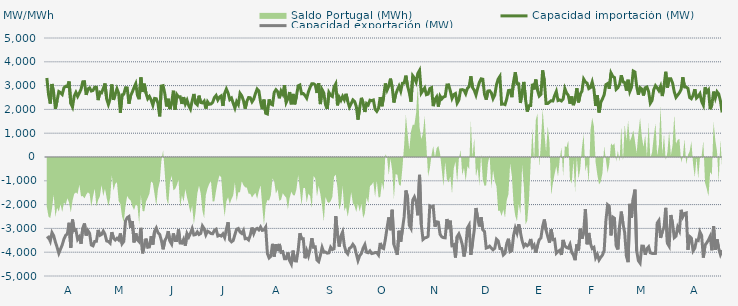
| Category | Capacidad importación (MW) | Capacidad exportación (MW) |
|---|---|---|
| 0 | 3320.625 | -3422.292 |
| 1900-01-01 | 2615.625 | -3370.417 |
| 1900-01-02 | 2244.375 | -3535.625 |
| 1900-01-03 | 3067.5 | -3176.25 |
| 1900-01-04 | 2692.458 | -3306.875 |
| 1900-01-05 | 2025 | -3576.042 |
| 1900-01-06 | 2373.833 | -3795 |
| 1900-01-07 | 2750.458 | -4045 |
| 1900-01-08 | 2704.167 | -3868.417 |
| 1900-01-09 | 2628.75 | -3691.667 |
| 1900-01-10 | 2910 | -3448.125 |
| 1900-01-11 | 2971.875 | -3293.375 |
| 1900-01-12 | 2958.5 | -3229.167 |
| 1900-01-13 | 3174.375 | -2764.583 |
| 1900-01-14 | 2253.75 | -3813.75 |
| 1900-01-15 | 2100 | -2628.667 |
| 1900-01-16 | 2557.5 | -3088.333 |
| 1900-01-17 | 2713.125 | -3062.25 |
| 1900-01-18 | 2546.875 | -3463.625 |
| 1900-01-19 | 2686.458 | -3359.458 |
| 1900-01-20 | 2850 | -3646.042 |
| 1900-01-21 | 3159.375 | -2992.292 |
| 1900-01-22 | 3166.875 | -2793.125 |
| 1900-01-23 | 2613.75 | -3298.833 |
| 1900-01-24 | 2857.5 | -3089.625 |
| 1900-01-25 | 2903.875 | -3210.125 |
| 1900-01-26 | 2772 | -3696.792 |
| 1900-01-27 | 2797.5 | -3731.25 |
| 1900-01-28 | 2930.625 | -3545.625 |
| 1900-01-29 | 2932.5 | -3541.875 |
| 1900-01-30 | 2390.625 | -3064.167 |
| 1900-01-31 | 2726.25 | -3293.333 |
| 1900-02-01 | 2694.375 | -3252.708 |
| 1900-02-02 | 2878.125 | -3111.875 |
| 1900-02-03 | 3088.125 | -3247.5 |
| 1900-02-04 | 2435.625 | -3528.958 |
| 1900-02-05 | 2206.875 | -3547.708 |
| 1900-02-06 | 2435.625 | -3618.75 |
| 1900-02-07 | 3046.875 | -3157.917 |
| 1900-02-08 | 2400 | -3406.875 |
| 1900-02-09 | 2640 | -3488.125 |
| 1900-02-10 | 2866.875 | -3413.542 |
| 1900-02-11 | 2675.625 | -3486.458 |
| 1900-02-12 | 1861.25 | -3211.667 |
| 1900-02-13 | 2611.875 | -3644.375 |
| 1900-02-14 | 2638.125 | -3547.083 |
| 1900-02-15 | 2906.25 | -2688.333 |
| 1900-02-16 | 2904.375 | -2549.583 |
| 1900-02-17 | 2240.625 | -2502.083 |
| 1900-02-18 | 2576.25 | -2981.667 |
| 1900-02-19 | 2732.25 | -2689.375 |
| 1900-02-20 | 2919.375 | -3586.875 |
| 1900-02-21 | 3078.75 | -3206.25 |
| 1900-02-22 | 2587.5 | -3481.875 |
| 1900-02-23 | 2430 | -3560.625 |
| 1900-02-24 | 3341.25 | -2977.542 |
| 1900-02-25 | 2733.75 | -4046.25 |
| 1900-02-26 | 3080.625 | -3725.417 |
| 1900-02-27 | 2681.25 | -3429.375 |
| 1900-02-28 | 2448.75 | -3793.125 |
| 1900-02-28 | 2544.125 | -3778.125 |
| 1900-03-01 | 2394.958 | -3328.125 |
| 1900-03-02 | 2175 | -3678.75 |
| 1900-03-03 | 2461.167 | -3117.375 |
| 1900-03-04 | 2448.75 | -2981.542 |
| 1900-03-05 | 2255.042 | -3185.833 |
| 1900-03-06 | 1708.042 | -3250.208 |
| 1900-03-07 | 2981.25 | -3508.125 |
| 1900-03-08 | 2998.125 | -3877.5 |
| 1900-03-09 | 2664.375 | -3519.375 |
| 1900-03-10 | 2124.375 | -3382.5 |
| 1900-03-11 | 2446.875 | -3115.792 |
| 1900-03-12 | 2015.417 | -3534.375 |
| 1900-03-13 | 2289.375 | -3658.125 |
| 1900-03-14 | 2784.375 | -3211.083 |
| 1900-03-15 | 1993.125 | -3504.792 |
| 1900-03-16 | 2624.875 | -3506.458 |
| 1900-03-17 | 2523.75 | -3042.583 |
| 1900-03-18 | 2531.25 | -3613.125 |
| 1900-03-19 | 2229.583 | -3620.625 |
| 1900-03-20 | 2515.875 | -3455.625 |
| 1900-03-21 | 2227.5 | -3723.75 |
| 1900-03-22 | 2388.375 | -3217.458 |
| 1900-03-23 | 2157.875 | -3361.542 |
| 1900-03-24 | 2014.583 | -3202.708 |
| 1900-03-25 | 2357.917 | -3006.583 |
| 1900-03-26 | 2647.75 | -3275.625 |
| 1900-03-27 | 2259.375 | -3258.75 |
| 1900-03-28 | 2191.875 | -3148.125 |
| 1900-03-29 | 2578.125 | -3256.875 |
| 1900-03-30 | 2289.375 | -3211.875 |
| 1900-03-31 | 2272.917 | -2898.25 |
| 1900-04-01 | 2349.75 | -3012.25 |
| 1900-04-02 | 2034.167 | -3270 |
| 1900-04-03 | 2319.375 | -3116.25 |
| 1900-04-04 | 2214.375 | -3159.375 |
| 1900-04-05 | 2229.167 | -3217.5 |
| 1900-04-06 | 2296.875 | -3223.125 |
| 1900-04-07 | 2497.5 | -3080.208 |
| 1900-04-08 | 2585.5 | -3034.292 |
| 1900-04-09 | 2394.375 | -3318.75 |
| 1900-04-10 | 2520 | -3286.875 |
| 1900-04-11 | 2570.625 | -3320.625 |
| 1900-04-12 | 2145 | -3229.583 |
| 1900-04-13 | 2673.75 | -3384.375 |
| 1900-04-14 | 2855.625 | -3040.333 |
| 1900-04-15 | 2689.875 | -2741.708 |
| 1900-04-16 | 2413.125 | -3485.625 |
| 1900-04-17 | 2476.875 | -3564.375 |
| 1900-04-18 | 2258.75 | -3510 |
| 1900-04-19 | 2056.875 | -3258.75 |
| 1900-04-20 | 2326.875 | -3036.667 |
| 1900-04-21 | 2203.125 | -3003.75 |
| 1900-04-22 | 2675.333 | -3153.417 |
| 1900-04-23 | 2572.5 | -3211.875 |
| 1900-04-24 | 2368.125 | -3082.917 |
| 1900-04-25 | 2032.5 | -3433.125 |
| 1900-04-26 | 2340 | -3418.125 |
| 1900-04-27 | 2499.375 | -3485.625 |
| 1900-04-28 | 2488.125 | -3277.5 |
| 1900-04-29 | 2317.5 | -2963.167 |
| 1900-04-30 | 2431.875 | -3217.5 |
| 1900-05-01 | 2668.125 | -3039.375 |
| 1900-05-02 | 2855.625 | -2998.125 |
| 1900-05-03 | 2778.75 | -3061.667 |
| 1900-05-04 | 2311.875 | -2941.042 |
| 1900-05-05 | 2010 | -3084.375 |
| 1900-05-06 | 2411.25 | -3065.625 |
| 1900-05-07 | 1837.917 | -2945.625 |
| 1900-05-08 | 1809.167 | -4055.625 |
| 1900-05-09 | 2419.792 | -4241.25 |
| 1900-05-10 | 2227.5 | -4173.75 |
| 1900-05-11 | 2191.875 | -3648.75 |
| 1900-05-12 | 2715 | -4183.125 |
| 1900-05-13 | 2826.625 | -3667.292 |
| 1900-05-14 | 2745 | -3950.625 |
| 1900-05-15 | 2467.5 | -3652.625 |
| 1900-05-16 | 2771.25 | -4006.875 |
| 1900-05-17 | 2640 | -3980.625 |
| 1900-05-18 | 3016.875 | -4271.25 |
| 1900-05-19 | 2292.292 | -4271.25 |
| 1900-05-20 | 2448.75 | -4010.625 |
| 1900-05-21 | 2730 | -4357.5 |
| 1900-05-22 | 2214.75 | -4501.875 |
| 1900-05-23 | 2650.208 | -3931.667 |
| 1900-05-24 | 2212.5 | -4361.25 |
| 1900-05-25 | 2565 | -4370.625 |
| 1900-05-26 | 2988.75 | -3920.625 |
| 1900-05-27 | 3024.375 | -3204.083 |
| 1900-05-28 | 2656.875 | -3437.708 |
| 1900-05-29 | 2664.375 | -3437.5 |
| 1900-05-30 | 2587.5 | -4254.375 |
| 1900-05-31 | 2473.125 | -3939.583 |
| 1900-06-01 | 2737.5 | -4156.875 |
| 1900-06-02 | 2932.5 | -3862.5 |
| 1900-06-03 | 3080.625 | -3412.708 |
| 1900-06-04 | 3078.125 | -3793.125 |
| 1900-06-05 | 3031.25 | -3776.25 |
| 1900-06-06 | 2689.875 | -4331.25 |
| 1900-06-07 | 3104.042 | -4396.875 |
| 1900-06-08 | 2223.25 | -4126.875 |
| 1900-06-09 | 2830.208 | -3799.583 |
| 1900-06-10 | 2694.375 | -3999.792 |
| 1900-06-11 | 2193.542 | -3994.167 |
| 1900-06-12 | 2019.375 | -4039.792 |
| 1900-06-13 | 2710.792 | -4026.667 |
| 1900-06-14 | 2589.292 | -3790.625 |
| 1900-06-15 | 2542.5 | -3888.75 |
| 1900-06-16 | 2943.75 | -3856.875 |
| 1900-06-17 | 3076.875 | -2486 |
| 1900-06-18 | 2169.583 | -3271.875 |
| 1900-06-19 | 2510.875 | -3762.292 |
| 1900-06-20 | 2379.375 | -3315.625 |
| 1900-06-21 | 2548.125 | -3149.875 |
| 1900-06-22 | 2405.625 | -3725.625 |
| 1900-06-23 | 2655.792 | -3978.75 |
| 1900-06-24 | 2338.917 | -4070.625 |
| 1900-06-25 | 2100.75 | -3836.25 |
| 1900-06-26 | 2239.583 | -3791.25 |
| 1900-06-27 | 2398.417 | -3671.25 |
| 1900-06-28 | 2333.375 | -3772.5 |
| 1900-06-29 | 2128.125 | -4065 |
| 1900-06-30 | 1568.375 | -4348.125 |
| 1900-07-01 | 2080.083 | -4146.125 |
| 1900-07-02 | 2486.208 | -4052.083 |
| 1900-07-03 | 2275.5 | -3824.583 |
| 1900-07-04 | 1891.708 | -3681.25 |
| 1900-07-05 | 2248.292 | -4001.25 |
| 1900-07-06 | 2190.75 | -4023.75 |
| 1900-07-07 | 2386.583 | -3945 |
| 1900-07-08 | 2366.708 | -4057.5 |
| 1900-07-09 | 2393.375 | -4042.25 |
| 1900-07-10 | 2007.375 | -4017.708 |
| 1900-07-11 | 1918.833 | -4016.25 |
| 1900-07-12 | 2042.417 | -4115.625 |
| 1900-07-13 | 2516.25 | -3611.25 |
| 1900-07-14 | 2132.708 | -3815.625 |
| 1900-07-15 | 2530.208 | -3849.375 |
| 1900-07-16 | 3090 | -3459.375 |
| 1900-07-17 | 2808.75 | -2974.875 |
| 1900-07-18 | 2978.125 | -2539.125 |
| 1900-07-19 | 3292.5 | -3075.208 |
| 1900-07-20 | 2935 | -2217.083 |
| 1900-07-21 | 2289.583 | -3673.125 |
| 1900-07-22 | 2619.375 | -3890.625 |
| 1900-07-23 | 2814.792 | -4110 |
| 1900-07-24 | 2979.375 | -3099.375 |
| 1900-07-25 | 2767.5 | -3556.875 |
| 1900-07-26 | 3099.375 | -3031.875 |
| 1900-07-27 | 3111.25 | -2508.75 |
| 1900-07-28 | 3418.125 | -1406.875 |
| 1900-07-29 | 2979.6 | -1681.6 |
| 1900-07-30 | 2705.333 | -2868.75 |
| 1900-07-31 | 2324.458 | -2999 |
| 1900-08-01 | 3414.375 | -1815.417 |
| 1900-08-02 | 3313.125 | -1677.917 |
| 1900-08-03 | 3144.583 | -1882.667 |
| 1900-08-04 | 3511.875 | -2448.75 |
| 1900-08-05 | 3639.375 | -750.708 |
| 1900-08-06 | 2688.958 | -2820 |
| 1900-08-07 | 2797.542 | -3465 |
| 1900-08-08 | 2902.5 | -3399.375 |
| 1900-08-09 | 2618.042 | -3382.5 |
| 1900-08-10 | 2643.417 | -3336.125 |
| 1900-08-11 | 2878.125 | -2058.75 |
| 1900-08-12 | 2915 | -2101.875 |
| 1900-08-13 | 2137.708 | -2068.125 |
| 1900-08-14 | 2411.042 | -2928.75 |
| 1900-08-15 | 2524.375 | -2722.5 |
| 1900-08-16 | 2118.542 | -2739.375 |
| 1900-08-17 | 2559.458 | -3244.292 |
| 1900-08-18 | 2440.833 | -3354.75 |
| 1900-08-19 | 2521.167 | -3387.25 |
| 1900-08-20 | 2546.333 | -3396.375 |
| 1900-08-21 | 3028.125 | -2606.25 |
| 1900-08-22 | 3031.875 | -3030 |
| 1900-08-23 | 2773.917 | -2675.625 |
| 1900-08-24 | 2465.417 | -3720 |
| 1900-08-25 | 2620.708 | -3684.375 |
| 1900-08-26 | 2665.625 | -4224.375 |
| 1900-08-27 | 2266.875 | -3343.125 |
| 1900-08-28 | 2395.625 | -3230.625 |
| 1900-08-29 | 2820.417 | -3421.875 |
| 1900-08-30 | 2831.667 | -3678.75 |
| 1900-08-31 | 2807.708 | -4181.25 |
| 1900-09-01 | 2656.917 | -3808.125 |
| 1900-09-02 | 2889.375 | -2983.125 |
| 1900-09-03 | 2955.417 | -2856.75 |
| 1900-09-04 | 3390.125 | -4111.875 |
| 1900-09-05 | 2918.167 | -3607.5 |
| 1900-09-06 | 2805 | -3067.5 |
| 1900-09-07 | 2603.792 | -2143.125 |
| 1900-09-08 | 2889.792 | -2566.125 |
| 1900-09-09 | 3138.75 | -2918.333 |
| 1900-09-10 | 3284.583 | -2531.167 |
| 1900-09-11 | 3266.875 | -3054.375 |
| 1900-09-12 | 2630.625 | -3127.125 |
| 1900-09-13 | 2410.625 | -3825 |
| 1900-09-14 | 2771.375 | -3800.625 |
| 1900-09-15 | 2785.375 | -3746.25 |
| 1900-09-16 | 2693.917 | -3833.125 |
| 1900-09-17 | 2453.958 | -3898.125 |
| 1900-09-18 | 2603.042 | -3832.458 |
| 1900-09-19 | 3040.208 | -3455.125 |
| 1900-09-20 | 3274.75 | -3527.125 |
| 1900-09-21 | 3387 | -3843.75 |
| 1900-09-22 | 2216.667 | -3847.5 |
| 1900-09-23 | 2229.75 | -4117.5 |
| 1900-09-24 | 2201.625 | -4044.375 |
| 1900-09-25 | 2438.958 | -3630 |
| 1900-09-26 | 2792.375 | -3435 |
| 1900-09-27 | 2803.958 | -3975 |
| 1900-09-28 | 2513.542 | -3933.75 |
| 1900-09-29 | 3165 | -3294.375 |
| 1900-09-30 | 3560.625 | -2987.875 |
| 1900-10-01 | 3075.25 | -3193.125 |
| 1900-10-02 | 3073.417 | -2827.208 |
| 1900-10-03 | 2270.625 | -3162.75 |
| 1900-10-04 | 2727.5 | -3519.375 |
| 1900-10-05 | 3154.417 | -3755.625 |
| 1900-10-06 | 2418.792 | -3661.875 |
| 1900-10-07 | 1908.75 | -3729.375 |
| 1900-10-08 | 2155 | -3669.625 |
| 1900-10-09 | 2159.708 | -3444.375 |
| 1900-10-10 | 3076.458 | -3791.25 |
| 1900-10-11 | 2842.292 | -3698.125 |
| 1900-10-12 | 3253.542 | -4020 |
| 1900-10-13 | 2809.042 | -3716.25 |
| 1900-10-14 | 2558.833 | -3474.375 |
| 1900-10-15 | 2631.875 | -3401.25 |
| 1900-10-16 | 3639.375 | -2911.875 |
| 1900-10-17 | 3192.292 | -2627.375 |
| 1900-10-18 | 2248.167 | -3073.125 |
| 1900-10-19 | 2244.375 | -3343.125 |
| 1900-10-20 | 2309.583 | -3596.625 |
| 1900-10-21 | 2366.167 | -3043.125 |
| 1900-10-22 | 2354.167 | -3474.375 |
| 1900-10-23 | 2578.958 | -3457.5 |
| 1900-10-24 | 2753.5 | -4040.625 |
| 1900-10-25 | 2372.208 | -3969.375 |
| 1900-10-26 | 2398.458 | -3918.75 |
| 1900-10-27 | 2354.167 | -4115.625 |
| 1900-10-28 | 2437.625 | -3484.625 |
| 1900-10-29 | 2874.167 | -3740.625 |
| 1900-10-30 | 2690.583 | -3803.75 |
| 1900-10-31 | 2590.875 | -3828.75 |
| 1900-11-01 | 2241.875 | -3671.25 |
| 1900-11-02 | 2542.292 | -4008.75 |
| 1900-11-03 | 2178.333 | -4123.125 |
| 1900-11-04 | 2426.208 | -4335 |
| 1900-11-05 | 2888.333 | -3675 |
| 1900-11-06 | 2294.25 | -3925 |
| 1900-11-07 | 2647.5 | -3010.625 |
| 1900-11-08 | 2762.083 | -3433.917 |
| 1900-11-09 | 3275.625 | -3162.875 |
| 1900-11-10 | 3155.625 | -2184.667 |
| 1900-11-11 | 3101.25 | -3667.5 |
| 1900-11-12 | 2874.417 | -3191.25 |
| 1900-11-13 | 2917.708 | -3645 |
| 1900-11-14 | 3152.792 | -3847.5 |
| 1900-11-15 | 2842.417 | -3796.875 |
| 1900-11-16 | 2144.167 | -4231.875 |
| 1900-11-17 | 2593.958 | -4093.125 |
| 1900-11-18 | 1870.625 | -4327.5 |
| 1900-11-19 | 2301.042 | -4213.125 |
| 1900-11-20 | 2442.042 | -4120.875 |
| 1900-11-21 | 2615.292 | -3922.5 |
| 1900-11-22 | 3039.375 | -2676.125 |
| 1900-11-23 | 3086.25 | -2005.625 |
| 1900-11-24 | 2871.042 | -2072.667 |
| 1900-11-25 | 3528.75 | -3293.5 |
| 1900-11-26 | 3386.25 | -2523.75 |
| 1900-11-27 | 3343.75 | -2572.708 |
| 1900-11-28 | 2842.25 | -3728.75 |
| 1900-11-29 | 2908.125 | -3885 |
| 1900-11-30 | 3053.458 | -2893.125 |
| 1900-12-01 | 3434.792 | -2293.333 |
| 1900-12-02 | 3154.708 | -2801.958 |
| 1900-12-03 | 3127.292 | -3183.75 |
| 1900-12-04 | 2791.958 | -4171.875 |
| 1900-12-05 | 3245.583 | -4417.5 |
| 1900-12-06 | 2756.125 | -1968.958 |
| 1900-12-07 | 2935 | -2553.75 |
| 1900-12-08 | 3611.25 | -1738.958 |
| 1900-12-09 | 3570 | -1370.167 |
| 1900-12-10 | 2968.958 | -3944 |
| 1900-12-11 | 2617.708 | -4351.875 |
| 1900-12-12 | 2914.583 | -4456.875 |
| 1900-12-13 | 2854.125 | -3740.625 |
| 1900-12-14 | 2583.75 | -3744.375 |
| 1900-12-15 | 2909.208 | -4106.25 |
| 1900-12-16 | 2942.333 | -3853.125 |
| 1900-12-17 | 2743.5 | -3772.5 |
| 1900-12-18 | 2260.208 | -4027.5 |
| 1900-12-19 | 2376.25 | -4050 |
| 1900-12-20 | 2831.25 | -4057.5 |
| 1900-12-21 | 2996.958 | -4050 |
| 1900-12-22 | 2902.5 | -2776.875 |
| 1900-12-23 | 2788.125 | -2668.792 |
| 1900-12-24 | 2970 | -3396.75 |
| 1900-12-25 | 2561.25 | -3137.083 |
| 1900-12-26 | 2979.917 | -2953.042 |
| 1900-12-27 | 3581.25 | -2136.583 |
| 1900-12-28 | 2918.958 | -3628.125 |
| 1900-12-29 | 3287.708 | -3748.125 |
| 1900-12-30 | 3286.826 | -2437.652 |
| 1900-12-31 | 3107.833 | -2813.833 |
| 1901-01-01 | 2736.333 | -3388.125 |
| 1901-01-02 | 2504.917 | -3326.25 |
| 1901-01-03 | 2600.458 | -2948.333 |
| 1901-01-04 | 2699.625 | -3098.625 |
| 1901-01-05 | 2836.292 | -2220 |
| 1901-01-06 | 3352.5 | -2514.125 |
| 1901-01-07 | 2943.75 | -2375.542 |
| 1901-01-08 | 2937.25 | -2352.083 |
| 1901-01-09 | 2881.625 | -3903.875 |
| 1901-01-10 | 2498.333 | -3340 |
| 1901-01-11 | 2447.917 | -3404.792 |
| 1901-01-12 | 2588.75 | -3945.417 |
| 1901-01-13 | 2846.667 | -3834.583 |
| 1901-01-14 | 2477.292 | -3492.083 |
| 1901-01-15 | 2547.917 | -3512.5 |
| 1901-01-16 | 2658.542 | -3144.375 |
| 1901-01-17 | 2334.167 | -3297.708 |
| 1901-01-18 | 2178.542 | -4225.417 |
| 1901-01-19 | 2929.917 | -3697.5 |
| 1901-01-20 | 2733.75 | -3605.625 |
| 1901-01-21 | 2820.083 | -3485.833 |
| 1901-01-22 | 2009.417 | -3333.958 |
| 1901-01-23 | 2196.333 | -3918.75 |
| 1901-01-24 | 2747.292 | -2905.833 |
| 1901-01-25 | 2479 | -3900 |
| 1901-01-26 | 2741.667 | -3459.583 |
| 1901-01-27 | 2647.5 | -3849.792 |
| 1901-01-28 | 2355.833 | -4095 |
| 1901-01-29 | 1870.833 | -3918.125 |